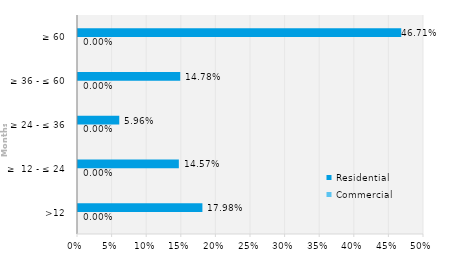
| Category | Commercial | Residential |
|---|---|---|
| >12 | 0 | 0.18 |
| ≥  12 - ≤ 24 | 0 | 0.146 |
| ≥ 24 - ≤ 36 | 0 | 0.06 |
| ≥ 36 - ≤ 60 | 0 | 0.148 |
| ≥ 60 | 0 | 0.467 |